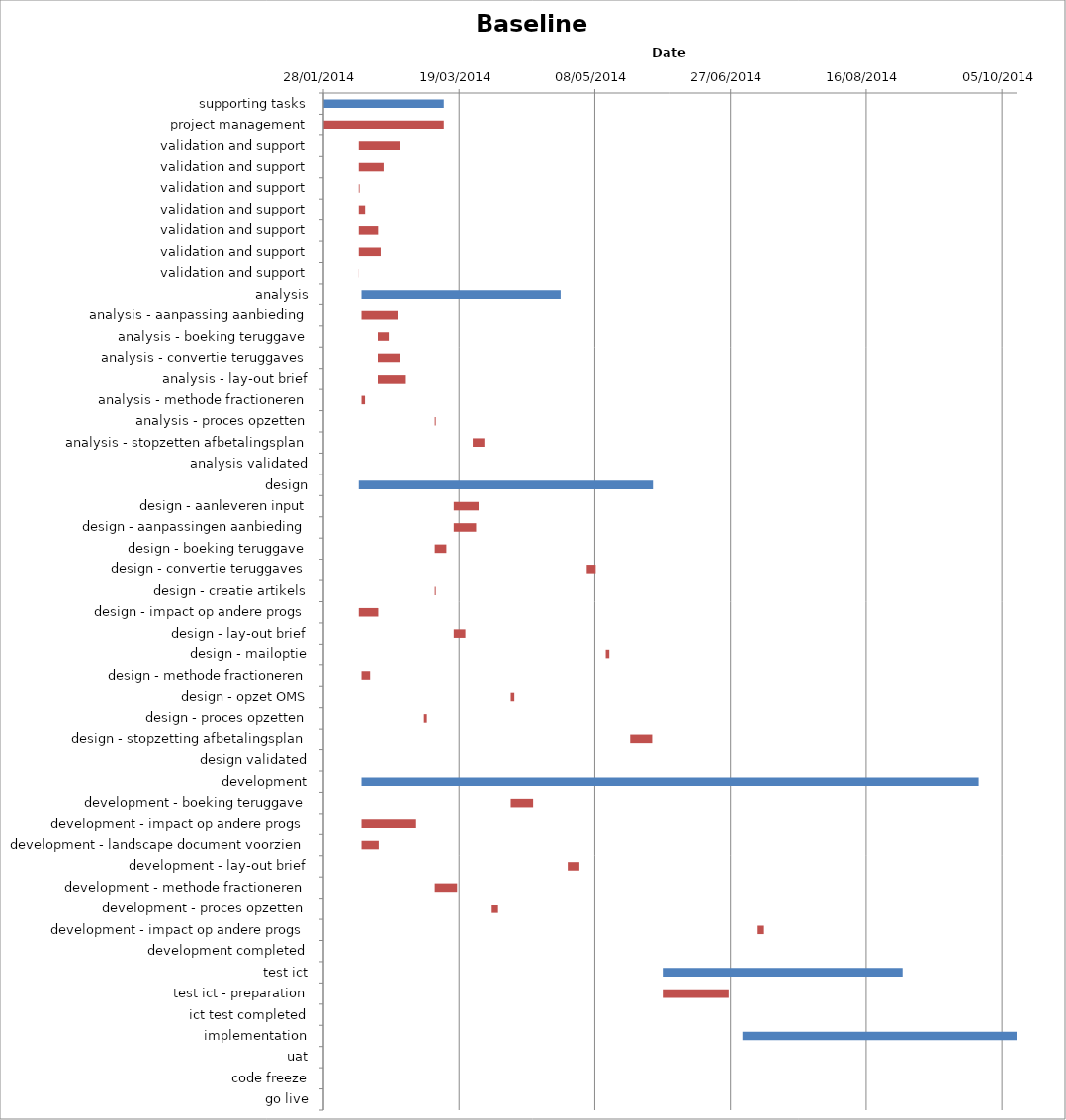
| Category | Baseline start | Actual duration |
|---|---|---|
| supporting tasks | 41667.333 | 44.333 |
| project management | 41667.333 | 44.333 |
| validation and support | 41680.333 | 15.083 |
| validation and support | 41680.333 | 9.167 |
| validation and support | 41680.333 | 0.292 |
| validation and support | 41680.333 | 2.333 |
| validation and support | 41680.333 | 7.125 |
| validation and support | 41680.333 | 8.083 |
| validation and support | 41680.333 | 0.042 |
| analysis | 41681.333 | 73.375 |
| analysis - aanpassing aanbieding | 41681.333 | 13.292 |
| analysis - boeking teruggave | 41687.333 | 4.042 |
| analysis - convertie teruggaves | 41687.333 | 8.25 |
| analysis - lay-out brief | 41687.333 | 10.375 |
| analysis - methode fractioneren | 41681.333 | 1.292 |
| analysis - proces opzetten | 41708.333 | 0.375 |
| analysis - stopzetten afbetalingsplan | 41722.333 | 4.292 |
| analysis validated | 41754.708 | 0 |
| design | 41680.333 | 108.375 |
| design - aanleveren input | 41715.333 | 9.167 |
| design - aanpassingen aanbieding | 41715.333 | 8.25 |
| design - boeking teruggave | 41708.333 | 4.292 |
| design - convertie teruggaves | 41764.333 | 3.292 |
| design - creatie artikels | 41708.333 | 0.375 |
| design - impact op andere progs | 41680.333 | 7.167 |
| design - lay-out brief | 41715.333 | 4.292 |
| design - mailoptie | 41771.333 | 1.333 |
| design - methode fractioneren | 41681.333 | 3.167 |
| design - opzet OMS | 41736.333 | 1.333 |
| design - proces opzetten | 41704.333 | 1.083 |
| design - stopzetting afbetalingsplan | 41780.333 | 8.083 |
| design validated | 41788.708 | 0 |
| development | 41681.333 | 227.375 |
| development - boeking teruggave | 41736.333 | 8.25 |
| development - impact op andere progs | 41681.333 | 20.125 |
| development - landscape document voorzien | 41681.333 | 6.333 |
| development - lay-out brief | 41757.333 | 4.292 |
| development - methode fractioneren | 41708.333 | 8.25 |
| development - proces opzetten | 41729.333 | 2.333 |
| development - impact op andere progs | 41827.333 | 2.333 |
| development completed | 41908.708 | 0 |
| test ict | 41792.333 | 88.375 |
| test ict - preparation | 41792.333 | 24.292 |
| ict test completed | 41880.708 | 0 |
| implementation | 41821.708 | 101 |
| uat | 41821.708 | 0 |
| code freeze | 41908.708 | 0 |
| go live | 41922.708 | 0 |